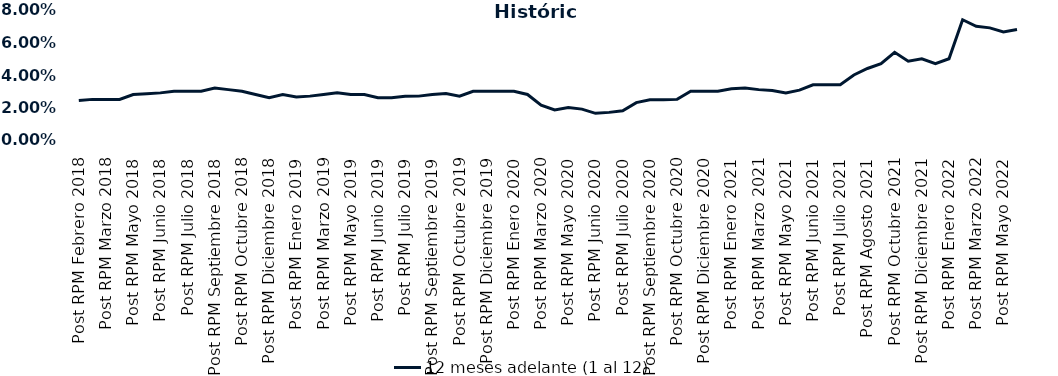
| Category | 12 meses adelante (1 al 12)  |
|---|---|
| Post RPM Febrero 2018 | 0.024 |
| Pre RPM Marzo 2018 | 0.025 |
| Post RPM Marzo 2018 | 0.025 |
| Pre RPM Mayo 2018 | 0.025 |
| Post RPM Mayo 2018 | 0.028 |
| Pre RPM Junio 2018 | 0.028 |
| Post RPM Junio 2018 | 0.029 |
| Pre RPM Julio 2018 | 0.03 |
| Post RPM Julio 2018 | 0.03 |
| Pre RPM Septiembre 2018 | 0.03 |
| Post RPM Septiembre 2018 | 0.032 |
| Pre RPM Octubre 2018 | 0.031 |
| Post RPM Octubre 2018 | 0.03 |
| Pre RPM Diciembre 2018 | 0.028 |
| Post RPM Diciembre 2018 | 0.026 |
| Pre RPM Enero 2019 | 0.028 |
| Post RPM Enero 2019 | 0.026 |
| Pre RPM Marzo 2019 | 0.027 |
| Post RPM Marzo 2019 | 0.028 |
| Pre RPM Mayo 2019 | 0.029 |
| Post RPM Mayo 2019 | 0.028 |
| Pre RPM Junio 2019 | 0.028 |
| Post RPM Junio 2019 | 0.026 |
| Pre RPM Julio 2019 | 0.026 |
| Post RPM Julio 2019 | 0.027 |
| Pre RPM Septiembre 2019 | 0.027 |
| Post RPM Septiembre 2019 | 0.028 |
| Pre RPM Octubre 2019 | 0.029 |
| Post RPM Octubre 2019 | 0.027 |
| Pre RPM Diciembre 2019 | 0.03 |
| Post RPM Diciembre 2019 | 0.03 |
| Pre RPM Enero 2020 | 0.03 |
| Post RPM Enero 2020 | 0.03 |
| Pre RPM Marzo 2020 | 0.028 |
| Post RPM Marzo 2020 | 0.022 |
| Pre RPM Mayo 2020 | 0.018 |
| Post RPM Mayo 2020 | 0.02 |
| Pre RPM Junio 2020 | 0.019 |
| Post RPM Junio 2020 | 0.016 |
| Pre RPM Julio 2020 | 0.017 |
| Post RPM Julio 2020 | 0.018 |
| Pre RPM Septiembre 2020 | 0.023 |
| Post RPM Septiembre 2020 | 0.025 |
| Pre RPM Octubre 2020 | 0.025 |
| Post RPM Octubre 2020 | 0.025 |
| Pre RPM Diciembre 2020 | 0.03 |
| Post RPM Diciembre 2020 | 0.03 |
| Pre RPM Enero 2021 | 0.03 |
| Post RPM Enero 2021 | 0.032 |
| Pre RPM Marzo 2021 | 0.032 |
| Post RPM Marzo 2021 | 0.031 |
| Pre RPM Mayo 2021 | 0.03 |
| Post RPM Mayo 2021 | 0.029 |
| Pre RPM Junio 2021 | 0.031 |
| Post RPM Junio 2021 | 0.034 |
| Pre RPM Julio 2021 | 0.034 |
| Post RPM Julio 2021 | 0.034 |
| Pre RPM Agosto 2021 | 0.04 |
| Post RPM Agosto 2021 | 0.044 |
| Pre RPM Octubre 2021 | 0.047 |
| Post RPM Octubre 2021 | 0.054 |
| Pre RPM Diciembre 2021 | 0.048 |
| Post RPM Diciembre 2021 | 0.05 |
| Pre RPM Enero 2022 | 0.047 |
| Post RPM Enero 2022 | 0.05 |
| Pre RPM Marzo 2022 | 0.074 |
| Post RPM Marzo 2022 | 0.07 |
| Pre RPM Mayo 2022 | 0.069 |
| Post RPM Mayo 2022 | 0.066 |
| Pre RPM Junio 2022 | 0.068 |